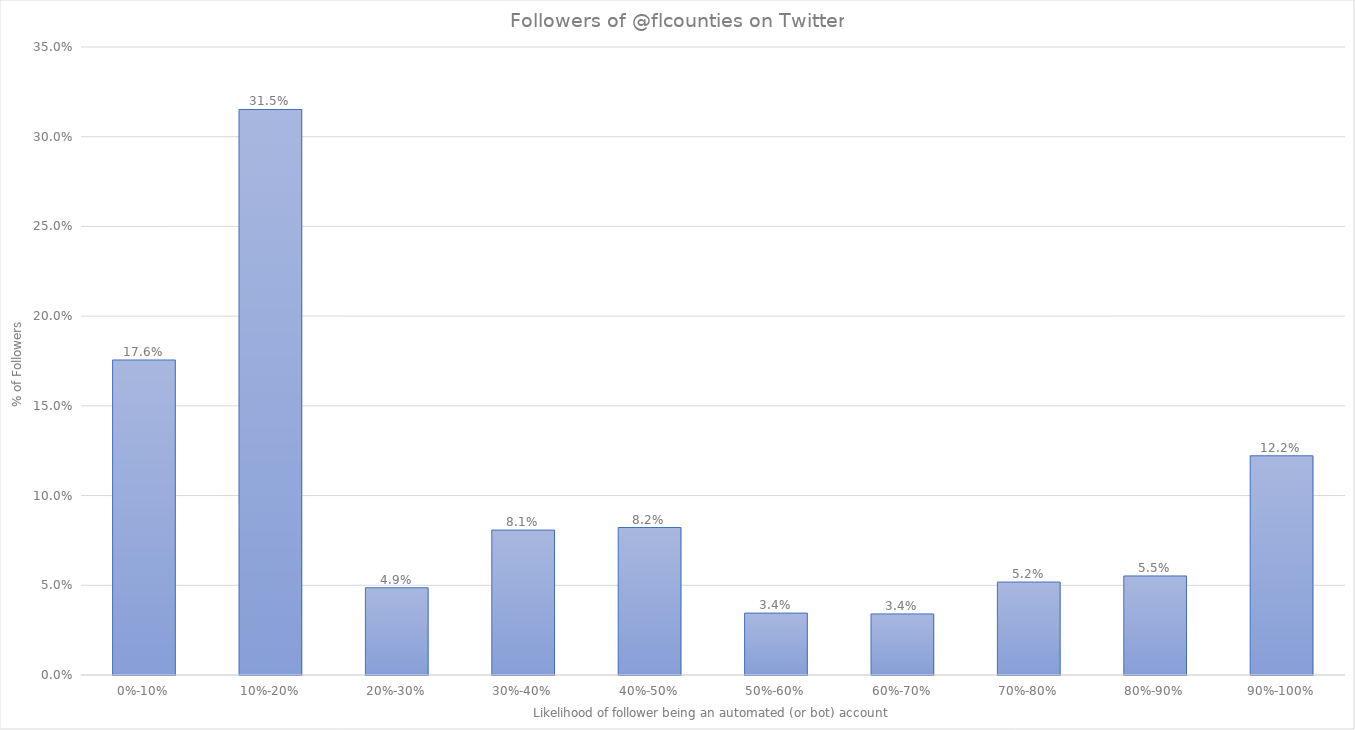
| Category | Series 0 |
|---|---|
| 0%-10% | 0.176 |
| 10%-20% | 0.315 |
| 20%-30% | 0.049 |
| 30%-40% | 0.081 |
| 40%-50% | 0.082 |
| 50%-60% | 0.034 |
| 60%-70% | 0.034 |
| 70%-80% | 0.052 |
| 80%-90% | 0.055 |
| 90%-100% | 0.122 |